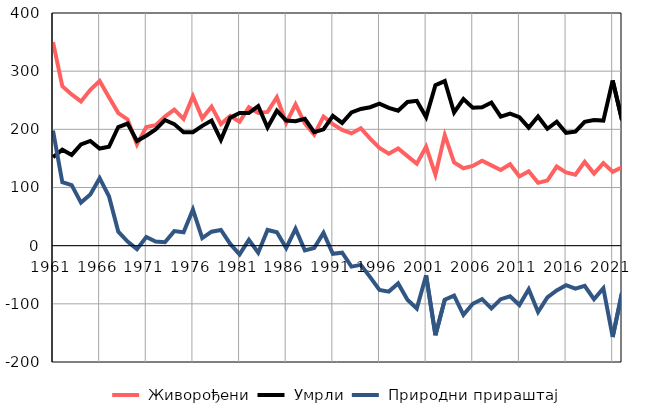
| Category |  Живорођени |  Умрли |  Природни прираштај |
|---|---|---|---|
| 1961.0 | 350 | 152 | 198 |
| 1962.0 | 274 | 165 | 109 |
| 1963.0 | 260 | 156 | 104 |
| 1964.0 | 248 | 174 | 74 |
| 1965.0 | 268 | 180 | 88 |
| 1966.0 | 283 | 167 | 116 |
| 1967.0 | 255 | 170 | 85 |
| 1968.0 | 228 | 204 | 24 |
| 1969.0 | 217 | 210 | 7 |
| 1970.0 | 174 | 180 | -6 |
| 1971.0 | 204 | 189 | 15 |
| 1972.0 | 207 | 200 | 7 |
| 1973.0 | 222 | 216 | 6 |
| 1974.0 | 234 | 209 | 25 |
| 1975.0 | 218 | 195 | 23 |
| 1976.0 | 257 | 195 | 62 |
| 1977.0 | 219 | 206 | 13 |
| 1978.0 | 239 | 215 | 24 |
| 1979.0 | 209 | 182 | 27 |
| 1980.0 | 223 | 220 | 3 |
| 1981.0 | 213 | 228 | -15 |
| 1982.0 | 238 | 228 | 10 |
| 1983.0 | 228 | 240 | -12 |
| 1984.0 | 230 | 203 | 27 |
| 1985.0 | 255 | 232 | 23 |
| 1986.0 | 211 | 215 | -4 |
| 1987.0 | 243 | 214 | 29 |
| 1988.0 | 210 | 218 | -8 |
| 1989.0 | 191 | 195 | -4 |
| 1990.0 | 222 | 200 | 22 |
| 1991.0 | 209 | 223 | -14 |
| 1992.0 | 199 | 211 | -12 |
| 1993.0 | 193 | 229 | -36 |
| 1994.0 | 202 | 235 | -33 |
| 1995.0 | 184 | 238 | -54 |
| 1996.0 | 168 | 244 | -76 |
| 1997.0 | 158 | 237 | -79 |
| 1998.0 | 167 | 232 | -65 |
| 1999.0 | 154 | 247 | -93 |
| 2000.0 | 141 | 249 | -108 |
| 2001.0 | 170 | 221 | -51 |
| 2002.0 | 122 | 276 | -154 |
| 2003.0 | 190 | 283 | -93 |
| 2004.0 | 143 | 229 | -86 |
| 2005.0 | 133 | 252 | -119 |
| 2006.0 | 137 | 237 | -100 |
| 2007.0 | 146 | 238 | -92 |
| 2008.0 | 138 | 246 | -108 |
| 2009.0 | 130 | 222 | -92 |
| 2010.0 | 140 | 227 | -87 |
| 2011.0 | 119 | 221 | -102 |
| 2012.0 | 128 | 203 | -75 |
| 2013.0 | 108 | 222 | -114 |
| 2014.0 | 112 | 201 | -89 |
| 2015.0 | 136 | 213 | -77 |
| 2016.0 | 126 | 194 | -68 |
| 2017.0 | 122 | 196 | -74 |
| 2018.0 | 144 | 213 | -69 |
| 2019.0 | 124 | 216 | -92 |
| 2020.0 | 142 | 215 | -73 |
| 2021.0 | 127 | 284 | -157 |
| 2022.0 | 135 | 216 | -81 |